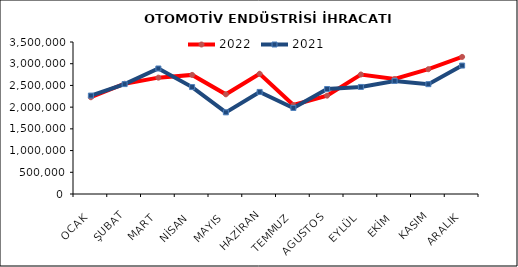
| Category | 2022 | 2021 |
|---|---|---|
| OCAK | 2227764.531 | 2266223.687 |
| ŞUBAT | 2538729.082 | 2530669.715 |
| MART | 2679520.973 | 2890087.282 |
| NİSAN | 2742291.672 | 2462170.548 |
| MAYIS | 2295116.397 | 1880240.257 |
| HAZİRAN | 2768913.221 | 2350260.897 |
| TEMMUZ | 2048287.172 | 1981647.662 |
| AGUSTOS | 2264756.037 | 2417746.892 |
| EYLÜL | 2751652.357 | 2465093.53 |
| EKİM | 2648321.247 | 2603902.251 |
| KASIM | 2873616.479 | 2529063.076 |
| ARALIK | 3156839.176 | 2957449.007 |